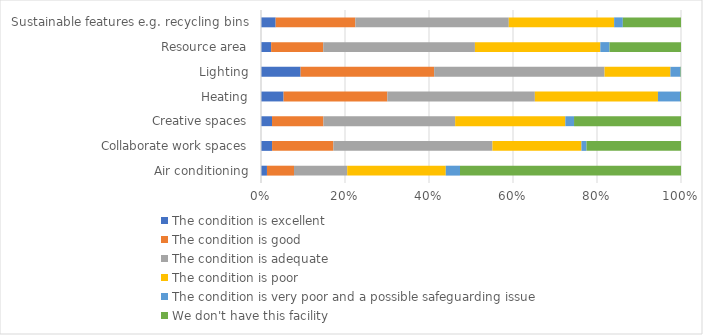
| Category | The condition is excellent | The condition is good | The condition is adequate | The condition is poor | The condition is very poor and a possible safeguarding issue | We don't have this facility |
|---|---|---|---|---|---|---|
| Air conditioning | 0.014 | 0.064 | 0.127 | 0.235 | 0.034 | 0.526 |
| Collaborate work spaces | 0.026 | 0.146 | 0.379 | 0.212 | 0.012 | 0.225 |
| Creative spaces | 0.026 | 0.122 | 0.314 | 0.262 | 0.021 | 0.255 |
| Heating | 0.054 | 0.247 | 0.351 | 0.293 | 0.053 | 0.002 |
| Lighting | 0.094 | 0.318 | 0.406 | 0.157 | 0.024 | 0.001 |
| Resource area | 0.024 | 0.124 | 0.361 | 0.299 | 0.022 | 0.17 |
| Sustainable features e.g. recycling bins | 0.035 | 0.19 | 0.365 | 0.251 | 0.021 | 0.138 |